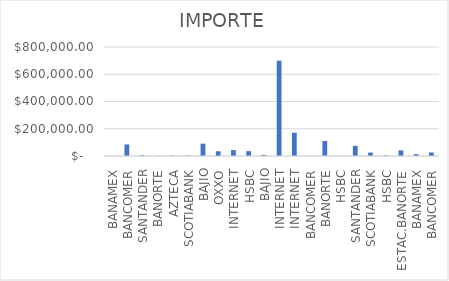
| Category | IMPORTE |
|---|---|
| BANAMEX | 94.98 |
| BANCOMER | 84683.31 |
| SANTANDER | 5843.81 |
| BANORTE | 1771.99 |
| AZTECA | 2726.52 |
| SCOTIABANK | 2886 |
| BAJIO | 90581.74 |
| OXXO | 34346.54 |
| INTERNET | 43660.98 |
| HSBC | 35654.67 |
| BAJIO | 8352.42 |
| INTERNET | 699587.66 |
| INTERNET | 170998.66 |
| BANCOMER | 376 |
| BANORTE | 110272.25 |
| HSBC | 376 |
| SANTANDER | 74434.49 |
| SCOTIABANK | 25175.35 |
| HSBC | 4207.15 |
| ESTAC.BANORTE | 41184 |
| BANAMEX | 13676.67 |
| BANCOMER | 25610.34 |